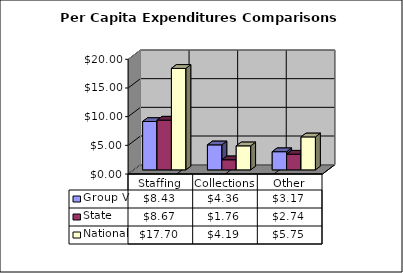
| Category | Group V | State | National |
|---|---|---|---|
| Staffing | 8.434 | 8.673 | 17.7 |
| Collections | 4.359 | 1.759 | 4.19 |
| Other | 3.169 | 2.74 | 5.75 |